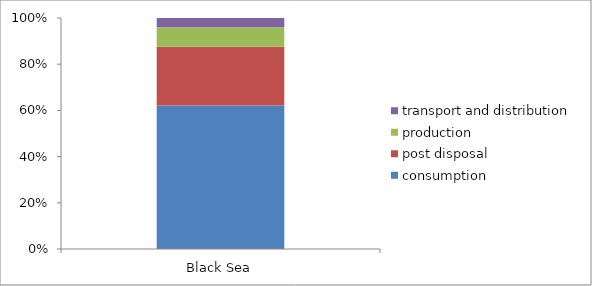
| Category | consumption | post disposal | production | transport and distribution |
|---|---|---|---|---|
| Black Sea | 0.621 | 0.255 | 0.084 | 0.04 |